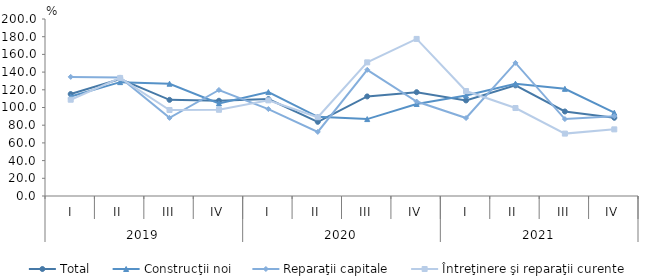
| Category | Total | Construcţii noi | Reparaţii capitale | Întreţinere şi reparaţii curente |
|---|---|---|---|---|
| 0 | 115.2 | 112.4 | 134.6 | 108.8 |
| 1 | 132.227 | 128.657 | 133.951 | 133.394 |
| 2 | 108.638 | 126.869 | 88.253 | 97.181 |
| 3 | 107.607 | 104.6 | 119.797 | 97.431 |
| 4 | 109.5 | 117.4 | 98.2 | 108.1 |
| 5 | 83.8 | 89.5 | 72.4 | 89 |
| 6 | 112.5 | 86.9 | 142.6 | 151 |
| 7 | 117.3 | 104 | 106.7 | 177.5 |
| 8 | 108 | 113.5 | 88.1 | 118.6 |
| 9 | 125 | 126.9 | 150.4 | 99.4 |
| 10 | 95.5 | 121.1 | 86.9 | 70.5 |
| 11 | 88.4 | 94.1 | 90.1 | 75.3 |